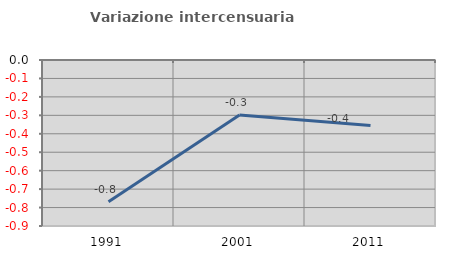
| Category | Variazione intercensuaria annua |
|---|---|
| 1991.0 | -0.769 |
| 2001.0 | -0.299 |
| 2011.0 | -0.355 |